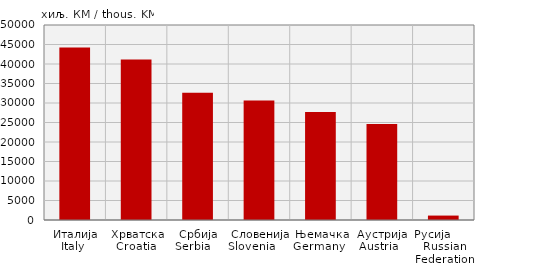
| Category | Извоз
Export |
|---|---|
| Италија
Italy  | 44253 |
| Хрватска
Croatia  | 41166 |
| Србија
Serbia    | 32648 |
| Словенија
Slovenia            | 30615 |
| Њемачка
Germany   | 27686 |
| Аустрија
Austria   | 24619 |
| Русија        Russian Federation | 1136 |